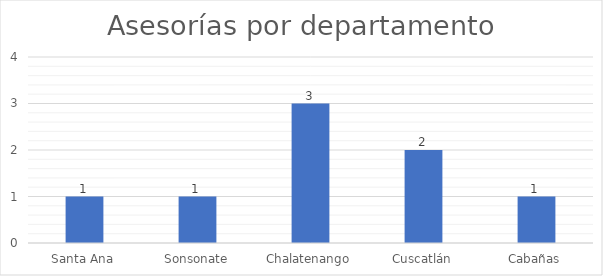
| Category | Series 0 |
|---|---|
| Santa Ana | 1 |
| Sonsonate | 1 |
| Chalatenango | 3 |
| Cuscatlán | 2 |
| Cabañas | 1 |